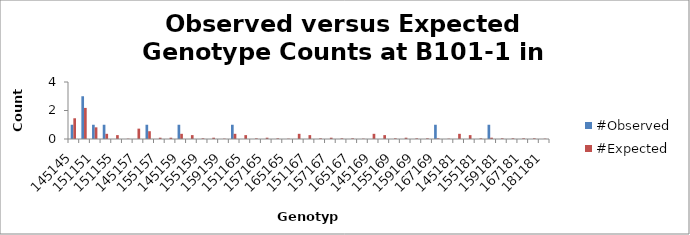
| Category | #Observed | #Expected |
|---|---|---|
| 145145.0 | 1 | 1.455 |
| 145151.0 | 3 | 2.182 |
| 151151.0 | 1 | 0.818 |
| 145155.0 | 1 | 0.364 |
| 151155.0 | 0 | 0.273 |
| 155155.0 | 0 | 0.023 |
| 145157.0 | 0 | 0.727 |
| 151157.0 | 1 | 0.545 |
| 155157.0 | 0 | 0.091 |
| 157157.0 | 0 | 0.091 |
| 145159.0 | 1 | 0.364 |
| 151159.0 | 0 | 0.273 |
| 155159.0 | 0 | 0.045 |
| 157159.0 | 0 | 0.091 |
| 159159.0 | 0 | 0.023 |
| 145165.0 | 1 | 0.364 |
| 151165.0 | 0 | 0.273 |
| 155165.0 | 0 | 0.045 |
| 157165.0 | 0 | 0.091 |
| 159165.0 | 0 | 0.045 |
| 165165.0 | 0 | 0.023 |
| 145167.0 | 0 | 0.364 |
| 151167.0 | 0 | 0.273 |
| 155167.0 | 0 | 0.045 |
| 157167.0 | 0 | 0.091 |
| 159167.0 | 0 | 0.045 |
| 165167.0 | 0 | 0.045 |
| 167167.0 | 0 | 0.023 |
| 145169.0 | 0 | 0.364 |
| 151169.0 | 0 | 0.273 |
| 155169.0 | 0 | 0.045 |
| 157169.0 | 0 | 0.091 |
| 159169.0 | 0 | 0.045 |
| 165169.0 | 0 | 0.045 |
| 167169.0 | 1 | 0.045 |
| 169169.0 | 0 | 0.023 |
| 145181.0 | 0 | 0.364 |
| 151181.0 | 0 | 0.273 |
| 155181.0 | 0 | 0.045 |
| 157181.0 | 1 | 0.091 |
| 159181.0 | 0 | 0.045 |
| 165181.0 | 0 | 0.045 |
| 167181.0 | 0 | 0.045 |
| 169181.0 | 0 | 0.045 |
| 181181.0 | 0 | 0.023 |